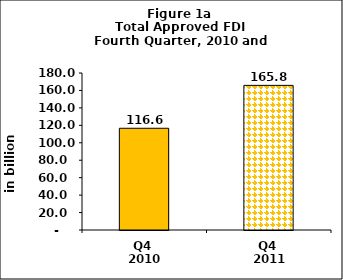
| Category | Series 0 |
|---|---|
| Q4 
2010 | 116.631 |
| Q4 
2011 | 165.825 |